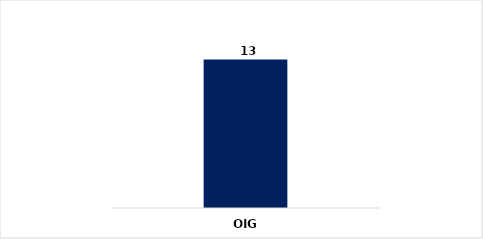
| Category | CANTIDAD |
|---|---|
| OIG | 13 |